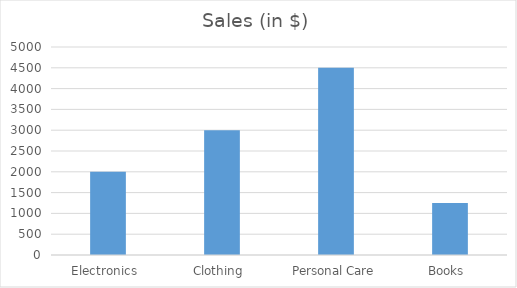
| Category | Sales (in $) |
|---|---|
| Electronics  | 2000 |
| Clothing  | 3000 |
| Personal Care | 4500 |
| Books  | 1250 |